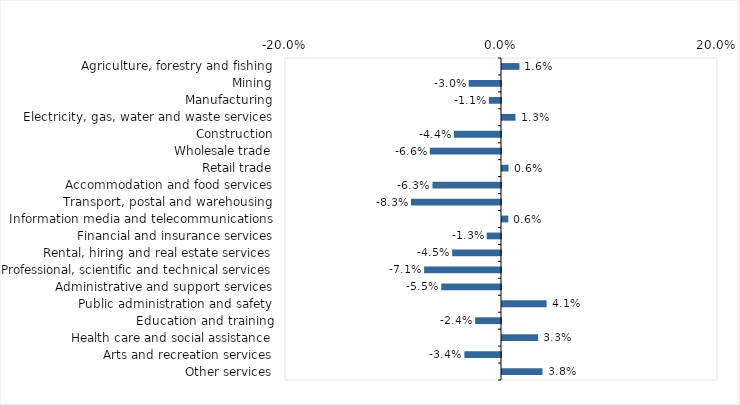
| Category | This week |
|---|---|
| Agriculture, forestry and fishing | 0.016 |
| Mining | -0.03 |
| Manufacturing | -0.011 |
| Electricity, gas, water and waste services | 0.013 |
| Construction | -0.044 |
| Wholesale trade | -0.066 |
| Retail trade | 0.006 |
| Accommodation and food services | -0.063 |
| Transport, postal and warehousing | -0.083 |
| Information media and telecommunications | 0.006 |
| Financial and insurance services | -0.013 |
| Rental, hiring and real estate services | -0.045 |
| Professional, scientific and technical services | -0.071 |
| Administrative and support services | -0.055 |
| Public administration and safety | 0.041 |
| Education and training | -0.024 |
| Health care and social assistance | 0.033 |
| Arts and recreation services | -0.034 |
| Other services | 0.038 |